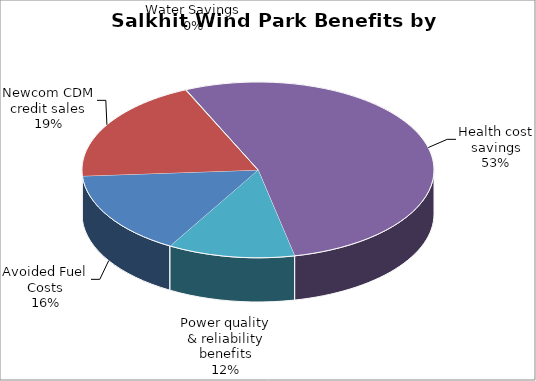
| Category | Series 0 |
|---|---|
| Avoided Fuel Costs | 0.156 |
| Newcom CDM credit sales | 0.193 |
| Water Savings | 0.001 |
| Health cost savings | 0.534 |
| Power quality & reliability benefits | 0.117 |